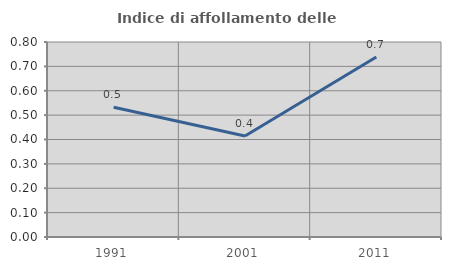
| Category | Indice di affollamento delle abitazioni  |
|---|---|
| 1991.0 | 0.532 |
| 2001.0 | 0.415 |
| 2011.0 | 0.738 |